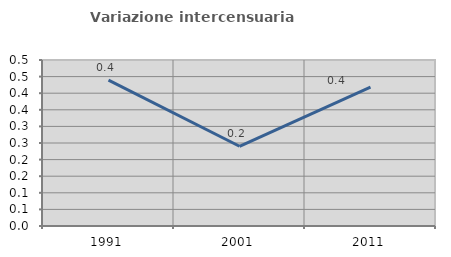
| Category | Variazione intercensuaria annua |
|---|---|
| 1991.0 | 0.439 |
| 2001.0 | 0.24 |
| 2011.0 | 0.419 |